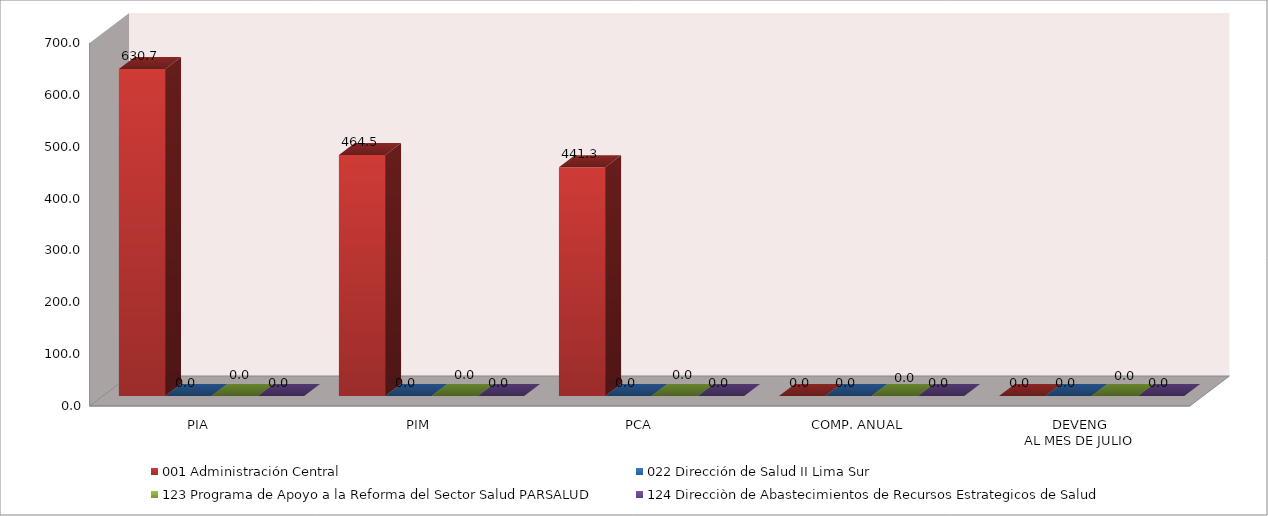
| Category | 001 Administración Central | 022 Dirección de Salud II Lima Sur | 123 Programa de Apoyo a la Reforma del Sector Salud PARSALUD | 124 Direcciòn de Abastecimientos de Recursos Estrategicos de Salud |
|---|---|---|---|---|
| PIA | 630.715 | 0 | 0 | 0 |
| PIM | 464.523 | 0 | 0 | 0 |
| PCA | 441.296 | 0 | 0 | 0 |
| COMP. ANUAL | 0 | 0 | 0 | 0 |
| DEVENG
AL MES DE JULIO | 0 | 0 | 0 | 0 |